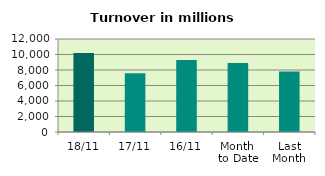
| Category | Series 0 |
|---|---|
| 18/11 | 10202.819 |
| 17/11 | 7582.555 |
| 16/11 | 9286.052 |
| Month 
to Date | 8892.321 |
| Last
Month | 7813.06 |